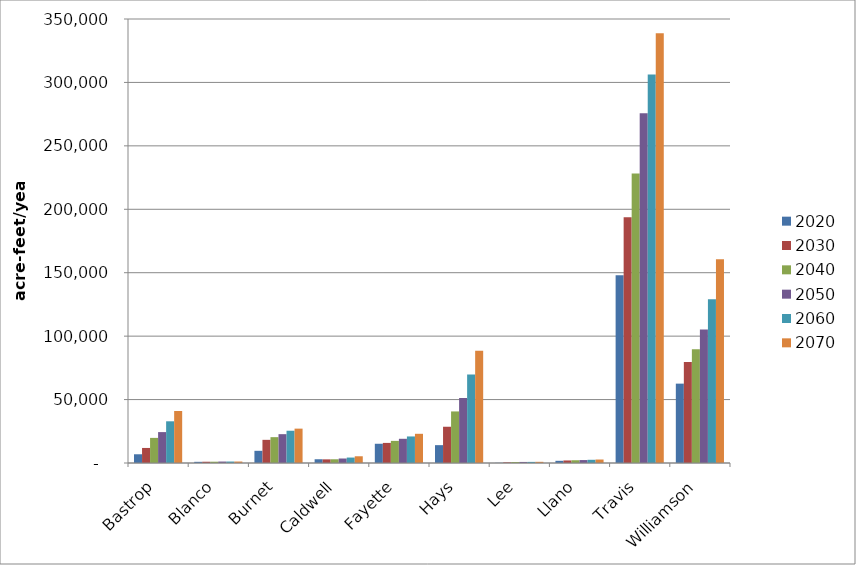
| Category | 2020 | 2030 | 2040 | 2050 | 2060 | 2070 |
|---|---|---|---|---|---|---|
| Bastrop | 6887 | 11864 | 19797 | 24361 | 32875 | 40997 |
| Blanco | 926 | 996 | 1018 | 1138 | 1152 | 1162 |
| Burnet | 9608 | 18256 | 20373 | 22731 | 25432 | 27092 |
| Caldwell | 2953 | 2869 | 2938 | 3540 | 4291 | 5305 |
| Fayette | 15167 | 15839 | 17429 | 19084 | 20923 | 23021 |
| Hays | 14073 | 28579 | 40651 | 51238 | 69741 | 88522 |
| Lee | 143 | 521 | 798 | 832 | 876 | 928 |
| Llano | 1725 | 2006 | 2175 | 2312 | 2530 | 2743 |
| Travis | 148005 | 193633 | 228203 | 275798 | 306286 | 338800 |
| Williamson | 62563 | 79614 | 89602 | 105240 | 129175 | 160638 |